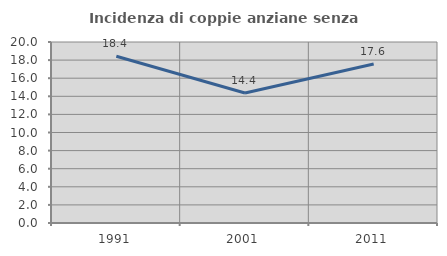
| Category | Incidenza di coppie anziane senza figli  |
|---|---|
| 1991.0 | 18.421 |
| 2001.0 | 14.368 |
| 2011.0 | 17.576 |